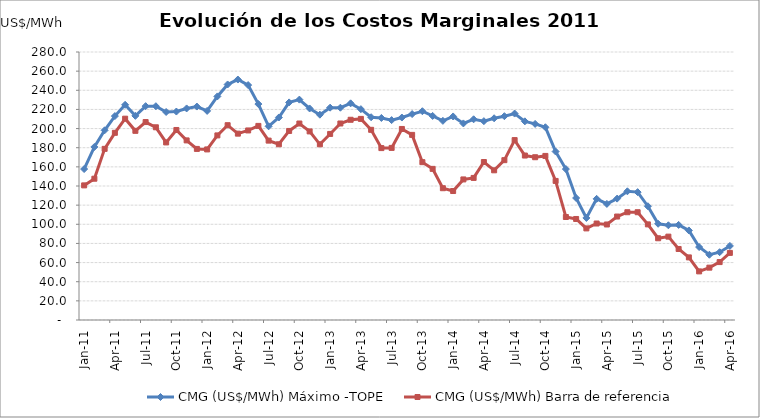
| Category | CMG (US$/MWh) Máximo -TOPE | CMG (US$/MWh) Barra de referencia |
|---|---|---|
| 2011-01-01 | 157.708 | 140.639 |
| 2011-02-01 | 180.807 | 147.614 |
| 2011-03-01 | 198.184 | 178.814 |
| 2011-04-01 | 213.042 | 195.562 |
| 2011-05-01 | 224.834 | 210.332 |
| 2011-06-01 | 213.27 | 197.63 |
| 2011-07-01 | 223.438 | 206.806 |
| 2011-08-01 | 223.369 | 201.332 |
| 2011-09-01 | 217.323 | 185.522 |
| 2011-10-01 | 217.803 | 198.535 |
| 2011-11-01 | 221.02 | 187.636 |
| 2011-12-01 | 223.002 | 178.745 |
| 2012-01-01 | 218.47 | 178.223 |
| 2012-02-01 | 233.6 | 192.871 |
| 2012-03-01 | 246.07 | 203.53 |
| 2012-04-01 | 251.23 | 194.688 |
| 2012-05-01 | 245.44 | 198.046 |
| 2012-06-01 | 225.62 | 202.791 |
| 2012-07-01 | 202.35 | 187.407 |
| 2012-08-01 | 211.59 | 183.594 |
| 2012-09-01 | 227.33 | 197.519 |
| 2012-10-01 | 230.25 | 205.275 |
| 2012-11-01 | 220.99 | 197.03 |
| 2012-12-01 | 214.51 | 183.538 |
| 2013-01-01 | 221.86 | 194.4 |
| 2013-02-01 | 221.79 | 205.3 |
| 2013-03-01 | 226.35 | 209.2 |
| 2013-04-01 | 220.3 | 210.1 |
| 2013-05-01 | 211.83 | 198.7 |
| 2013-06-01 | 211.1 | 179.6 |
| 2013-07-01 | 208.84 | 179.8 |
| 2013-08-01 | 211.53 | 199.6 |
| 2013-09-01 | 215.15 | 193.4 |
| 2013-10-01 | 218.13 | 164.9 |
| 2013-11-01 | 213.24 | 157.9 |
| 2013-12-01 | 208.06 | 137.696 |
| 2014-01-01 | 212.67 | 134.746 |
| 2014-02-01 | 205.39 | 146.869 |
| 2014-03-01 | 209.7 | 148.45 |
| 2014-04-01 | 207.76 | 165.047 |
| 2014-05-01 | 210.78 | 156.398 |
| 2014-06-01 | 212.95 | 166.999 |
| 2014-07-01 | 215.69 | 187.953 |
| 2014-08-01 | 207.54 | 171.817 |
| 2014-09-01 | 204.87 | 170.068 |
| 2014-10-01 | 201.37 | 171.429 |
| 2014-11-01 | 176 | 145.313 |
| 2014-12-01 | 157.67 | 107.601 |
| 2015-01-01 | 127.47 | 105.546 |
| 2015-02-01 | 106.63 | 95.7 |
| 2015-03-01 | 126.58 | 100.8 |
| 2015-04-01 | 121.28 | 99.8 |
| 2015-05-01 | 126.82 | 108.1 |
| 2015-06-01 | 134.46 | 112.6 |
| 2015-07-01 | 133.6 | 112.6 |
| 2015-08-01 | 118.86 | 99.9 |
| 2015-09-01 | 100.53 | 85.4 |
| 2015-10-01 | 98.95 | 87.1 |
| 2015-11-01 | 99.37 | 74.2 |
| 2015-12-01 | 93.56 | 65.4 |
| 2016-01-01 | 76.21 | 50.8 |
| 2016-02-01 | 68.18 | 54.7 |
| 2016-03-01 | 70.84 | 60.5 |
| 2016-04-01 | 77.38 | 70.1 |